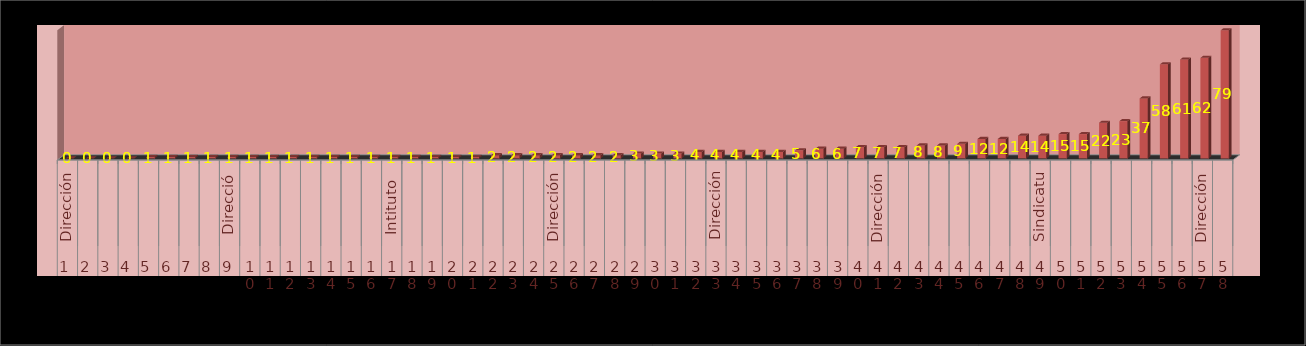
| Category | Series 0 | Series 1 |
|---|---|---|
| 0 |  | 0 |
| 1 |  | 0 |
| 2 |  | 0 |
| 3 |  | 0 |
| 4 |  | 1 |
| 5 |  | 1 |
| 6 |  | 1 |
| 7 |  | 1 |
| 8 |  | 1 |
| 9 |  | 1 |
| 10 |  | 1 |
| 11 |  | 1 |
| 12 |  | 1 |
| 13 |  | 1 |
| 14 |  | 1 |
| 15 |  | 1 |
| 16 |  | 1 |
| 17 |  | 1 |
| 18 |  | 1 |
| 19 |  | 1 |
| 20 |  | 1 |
| 21 |  | 2 |
| 22 |  | 2 |
| 23 |  | 2 |
| 24 |  | 2 |
| 25 |  | 2 |
| 26 |  | 2 |
| 27 |  | 2 |
| 28 |  | 3 |
| 29 |  | 3 |
| 30 |  | 3 |
| 31 |  | 4 |
| 32 |  | 4 |
| 33 |  | 4 |
| 34 |  | 4 |
| 35 |  | 4 |
| 36 |  | 5 |
| 37 |  | 6 |
| 38 |  | 6 |
| 39 |  | 7 |
| 40 |  | 7 |
| 41 |  | 7 |
| 42 |  | 8 |
| 43 |  | 8 |
| 44 |  | 9 |
| 45 |  | 12 |
| 46 |  | 12 |
| 47 |  | 14 |
| 48 |  | 14 |
| 49 |  | 15 |
| 50 |  | 15 |
| 51 |  | 22 |
| 52 |  | 23 |
| 53 |  | 37 |
| 54 |  | 58 |
| 55 |  | 61 |
| 56 |  | 62 |
| 57 |  | 79 |